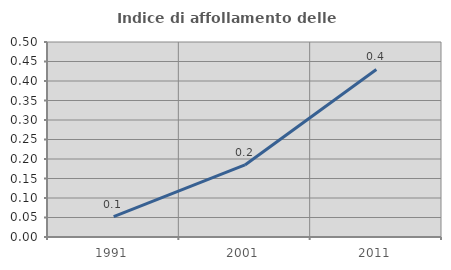
| Category | Indice di affollamento delle abitazioni  |
|---|---|
| 1991.0 | 0.052 |
| 2001.0 | 0.185 |
| 2011.0 | 0.43 |